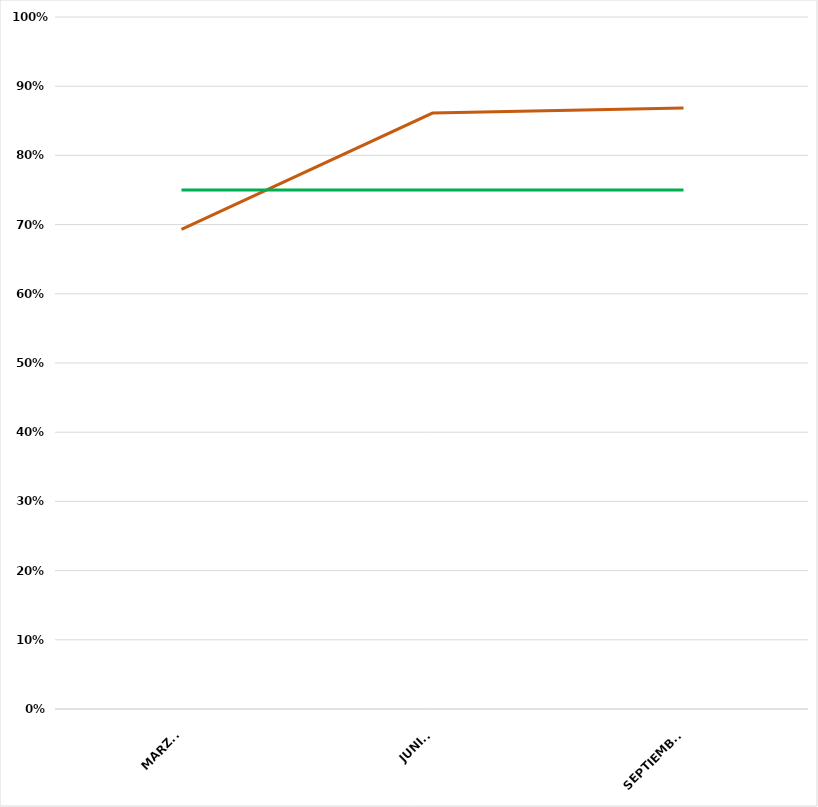
| Category | VALOR  | META PONDERADA |
|---|---|---|
| MARZO | 0.693 | 0.75 |
| JUNIO | 0.861 | 0.75 |
| SEPTIEMBRE | 0.869 | 0.75 |